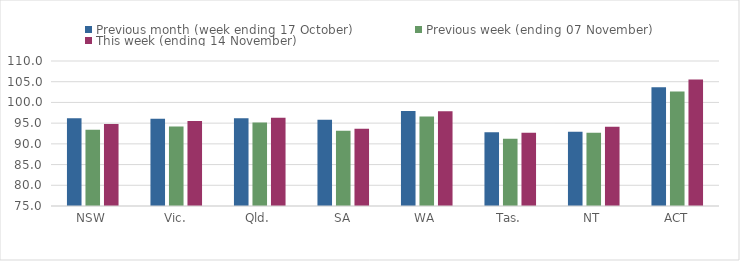
| Category | Previous month (week ending 17 October) | Previous week (ending 07 November) | This week (ending 14 November) |
|---|---|---|---|
| NSW | 96.16 | 93.41 | 94.78 |
| Vic. | 96.04 | 94.21 | 95.52 |
| Qld. | 96.21 | 95.13 | 96.29 |
| SA | 95.79 | 93.18 | 93.66 |
| WA | 97.96 | 96.6 | 97.86 |
| Tas. | 92.78 | 91.25 | 92.7 |
| NT | 92.94 | 92.68 | 94.11 |
| ACT | 103.65 | 102.65 | 105.52 |